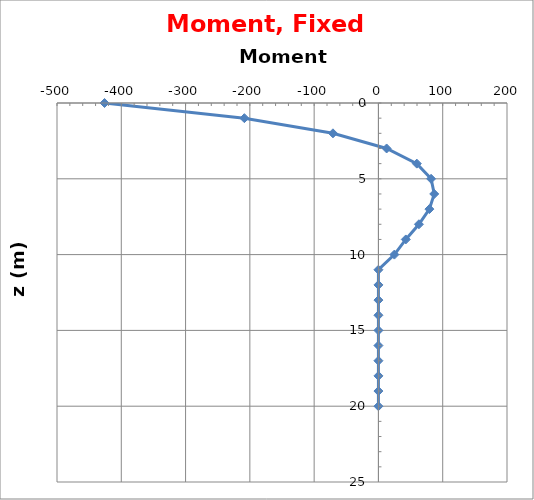
| Category | Series 0 |
|---|---|
| -426.05865190444086 | 0 |
| -208.54559358144067 | 1 |
| -70.74493165407678 | 2 |
| 12.754197325097786 | 3 |
| 59.715789983628824 | 4 |
| 81.92107092111497 | 5 |
| 86.83258750116143 | 6 |
| 79.25830464333241 | 7 |
| 63.01569961510725 | 8 |
| 42.59585682383036 | 9 |
| 24.827562608672007 | 10 |
| 0.0 | 11 |
| 0.0 | 12 |
| 0.0 | 13 |
| 0.0 | 14 |
| 0.0 | 15 |
| 0.0 | 16 |
| 0.0 | 17 |
| 0.0 | 18 |
| 0.0 | 19 |
| 0.0 | 20 |